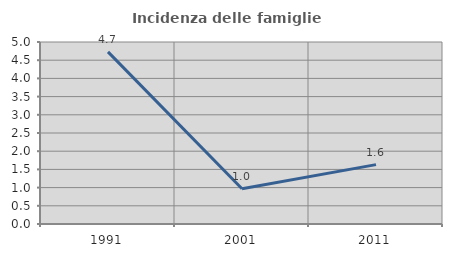
| Category | Incidenza delle famiglie numerose |
|---|---|
| 1991.0 | 4.73 |
| 2001.0 | 0.97 |
| 2011.0 | 1.632 |